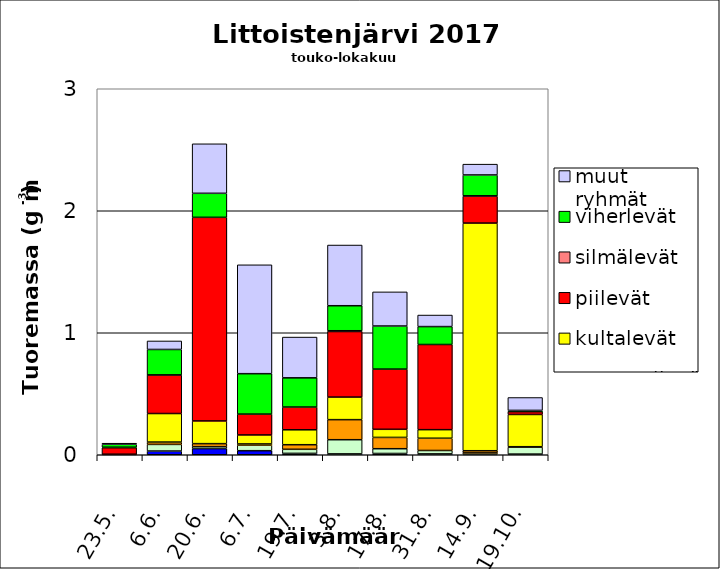
| Category | syanobakteerit | nielulevät | panssarilevät | kultalevät | piilevät | silmälevät | viherlevät | muut ryhmät |
|---|---|---|---|---|---|---|---|---|
| 23.5. | 0.003 | 0 | 0.002 | 0 | 0.053 | 0.004 | 0.024 | 0.009 |
| 6.6. | 0.031 | 0.054 | 0.019 | 0.234 | 0.317 | 0 | 0.208 | 0.07 |
| 20.6. | 0.051 | 0.016 | 0.025 | 0.186 | 1.669 | 0 | 0.197 | 0.406 |
| 6.7. | 0.033 | 0.046 | 0.01 | 0.074 | 0.171 | 0 | 0.331 | 0.892 |
| 19.7. | 0.011 | 0.033 | 0.038 | 0.122 | 0.187 | 0 | 0.239 | 0.334 |
| 3.8. | 0.007 | 0.116 | 0.164 | 0.185 | 0.537 | 0.006 | 0.205 | 0.498 |
| 17.8. | 0.01 | 0.039 | 0.093 | 0.066 | 0.494 | 0 | 0.353 | 0.28 |
| 31.8. | 0.007 | 0.028 | 0.101 | 0.07 | 0.698 | 0 | 0.147 | 0.095 |
| 14.9. | 0.003 | 0.012 | 0.018 | 1.866 | 0.221 | 0.003 | 0.171 | 0.088 |
| 19.10. | 0.005 | 0.058 | 0.003 | 0.264 | 0.023 | 0 | 0.01 | 0.106 |